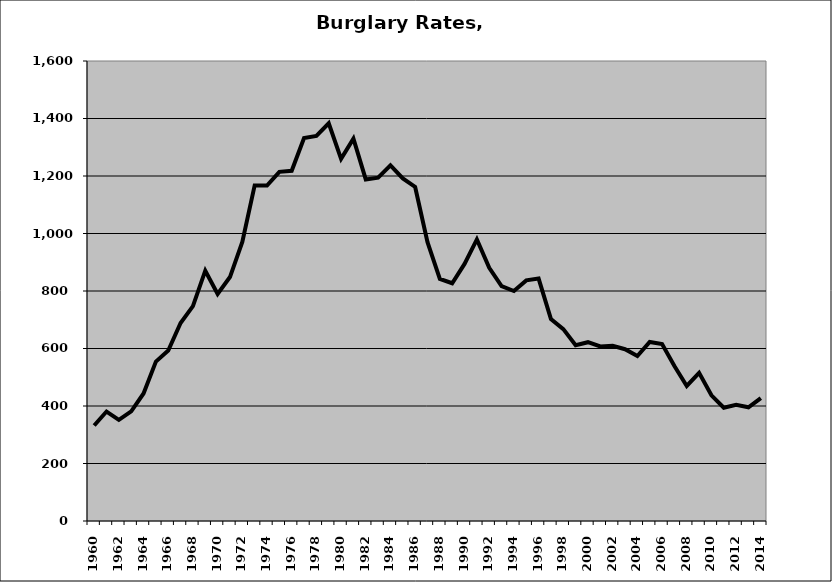
| Category | Burglary |
|---|---|
| 1960.0 | 332.056 |
| 1961.0 | 380.769 |
| 1962.0 | 351.626 |
| 1963.0 | 381.452 |
| 1964.0 | 443.6 |
| 1965.0 | 554.545 |
| 1966.0 | 593.015 |
| 1967.0 | 688.603 |
| 1968.0 | 747.292 |
| 1969.0 | 870.567 |
| 1970.0 | 789.945 |
| 1971.0 | 848.562 |
| 1972.0 | 970.769 |
| 1973.0 | 1167.273 |
| 1974.0 | 1166.766 |
| 1975.0 | 1214.489 |
| 1976.0 | 1218.063 |
| 1977.0 | 1331.695 |
| 1978.0 | 1339.206 |
| 1979.0 | 1383.251 |
| 1980.0 | 1259.821 |
| 1981.0 | 1329.854 |
| 1982.0 | 1188.128 |
| 1983.0 | 1194.154 |
| 1984.0 | 1236.8 |
| 1985.0 | 1191.747 |
| 1986.0 | 1161.798 |
| 1987.0 | 970.095 |
| 1988.0 | 842.3 |
| 1989.0 | 826.945 |
| 1990.0 | 894.294 |
| 1991.0 | 979.298 |
| 1992.0 | 880.75 |
| 1993.0 | 816.861 |
| 1994.0 | 800 |
| 1995.0 | 836.921 |
| 1996.0 | 843.163 |
| 1997.0 | 702.135 |
| 1998.0 | 667.427 |
| 1999.0 | 611.299 |
| 2000.0 | 621.918 |
| 2001.0 | 607.137 |
| 2002.0 | 609.214 |
| 2003.0 | 597.581 |
| 2004.0 | 573.618 |
| 2005.0 | 622.839 |
| 2006.0 | 615.175 |
| 2007.0 | 538.862 |
| 2008.0 | 469.682 |
| 2009.0 | 515.41 |
| 2010.0 | 437.182 |
| 2011.0 | 393.999 |
| 2012.0 | 403.94 |
| 2013.0 | 395.655 |
| 2014.0 | 427.564 |